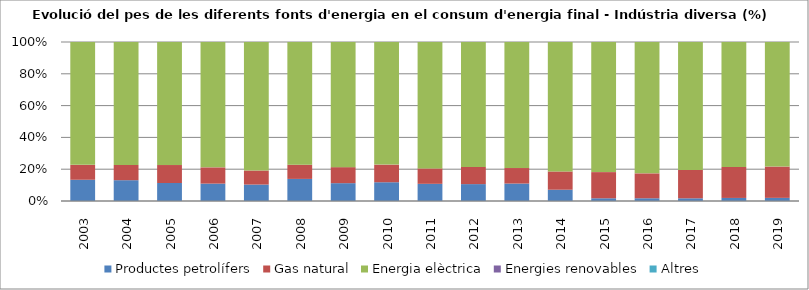
| Category | Productes petrolífers | Gas natural | Energia elèctrica | Energies renovables | Altres |
|---|---|---|---|---|---|
| 2003.0 | 1.11 | 0.78 | 6.42 | 0 | 0 |
| 2004.0 | 1.08 | 0.79 | 6.38 | 0 | 0 |
| 2005.0 | 0.94 | 0.94 | 6.43 | 0 | 0 |
| 2006.0 | 0.91 | 0.85 | 6.56 | 0 | 0 |
| 2007.0 | 0.82 | 0.7 | 6.41 | 0 | 0 |
| 2008.0 | 0.92 | 0.59 | 5.11 | 0 | 0 |
| 2009.0 | 0.69 | 0.62 | 4.84 | 0 | 0 |
| 2010.0 | 0.67 | 0.63 | 4.38 | 0 | 0 |
| 2011.0 | 0.58 | 0.52 | 4.27 | 0 | 0 |
| 2012.0 | 0.53 | 0.54 | 3.92 | 0 | 0 |
| 2013.0 | 0.54 | 0.48 | 3.9 | 0 | 0 |
| 2014.0 | 0.34 | 0.55 | 3.9 | 0 | 0 |
| 2015.0 | 0.08 | 0.77 | 3.83 | 0 | 0 |
| 2016.0 | 0.08 | 0.73 | 3.85 | 0 | 0 |
| 2017.0 | 0.08 | 0.84 | 3.8 | 0 | 0 |
| 2018.0 | 0.09 | 0.91 | 3.67 | 0 | 0 |
| 2019.0 | 0.09 | 0.9 | 3.58 | 0 | 0 |